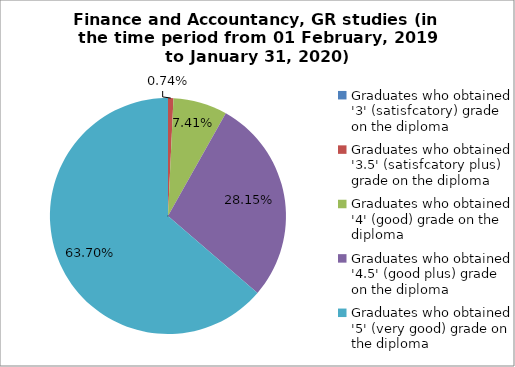
| Category | Series 1 |
|---|---|
| Graduates who obtained '3' (satisfcatory) grade on the diploma | 0 |
| Graduates who obtained '3.5' (satisfcatory plus) grade on the diploma | 0.741 |
| Graduates who obtained '4' (good) grade on the diploma | 7.407 |
| Graduates who obtained '4.5' (good plus) grade on the diploma | 28.148 |
| Graduates who obtained '5' (very good) grade on the diploma | 63.704 |